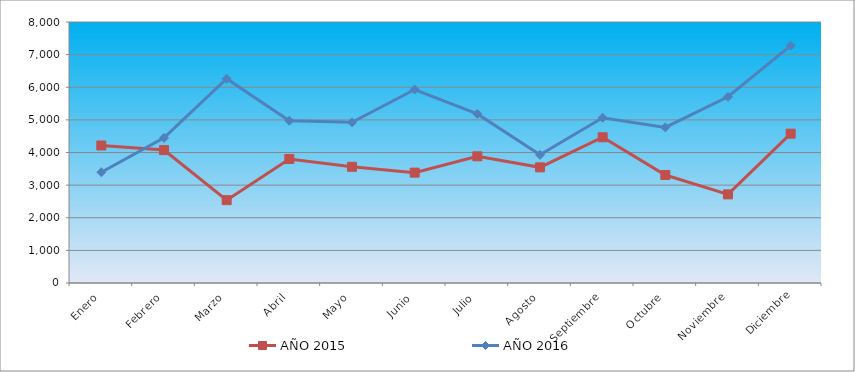
| Category | AÑO 2015 | AÑO 2016 |
|---|---|---|
| Enero | 4215 | 3396 |
| Febrero | 4074 | 4448 |
| Marzo | 2539 | 6261 |
| Abril | 3801 | 4975 |
| Mayo | 3562 | 4924 |
| Junio | 3383 | 5930 |
| Julio | 3883 | 5184 |
| Agosto | 3545 | 3928 |
| Septiembre | 4467 | 5065 |
| Octubre | 3310 | 4769 |
| Noviembre | 2716 | 5708 |
| Diciembre | 4577 | 7277 |